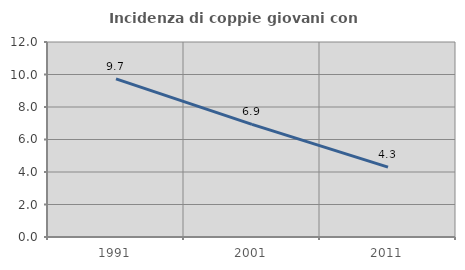
| Category | Incidenza di coppie giovani con figli |
|---|---|
| 1991.0 | 9.735 |
| 2001.0 | 6.931 |
| 2011.0 | 4.301 |